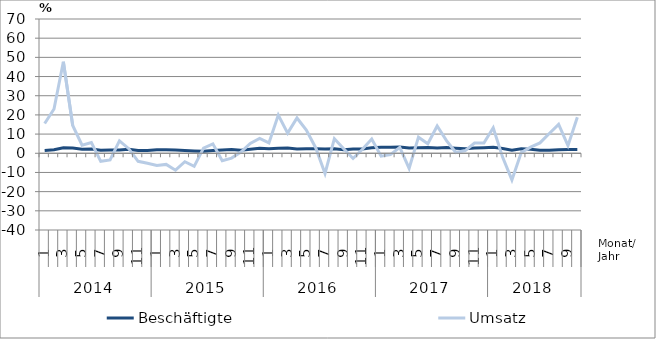
| Category | Beschäftigte | Umsatz |
|---|---|---|
| 0 | 1.4 | 15.5 |
| 1 | 1.8 | 23.1 |
| 2 | 2.9 | 47.7 |
| 3 | 2.7 | 14.5 |
| 4 | 2.1 | 4.2 |
| 5 | 2.2 | 5.6 |
| 6 | 1.6 | -4.2 |
| 7 | 1.7 | -3.5 |
| 8 | 1.7 | 6.5 |
| 9 | 2.1 | 2.4 |
| 10 | 1.4 | -4.2 |
| 11 | 1.4 | -5.2 |
| 12 | 1.8 | -6.4 |
| 13 | 1.8 | -5.8 |
| 14 | 1.7 | -8.8 |
| 15 | 1.5 | -4.4 |
| 16 | 1.2 | -6.8 |
| 17 | 1 | 2.7 |
| 18 | 1.4 | 4.9 |
| 19 | 1.7 | -3.9 |
| 20 | 2 | -2.5 |
| 21 | 1.6 | 0.6 |
| 22 | 2.1 | 5.1 |
| 23 | 2.6 | 7.7 |
| 24 | 2.4 | 5.4 |
| 25 | 2.6 | 19.9 |
| 26 | 2.7 | 10.5 |
| 27 | 2.2 | 18.4 |
| 28 | 2.3 | 12.1 |
| 29 | 2.3 | 2.9 |
| 30 | 2.2 | -10.5 |
| 31 | 2.4 | 7.6 |
| 32 | 1.8 | 2.4 |
| 33 | 2.2 | -2.7 |
| 34 | 2.2 | 2.1 |
| 35 | 2.9 | 7.4 |
| 36 | 3.2 | -1.5 |
| 37 | 3.2 | -0.7 |
| 38 | 3.3 | 3.1 |
| 39 | 2.7 | -7.9 |
| 40 | 2.9 | 8.4 |
| 41 | 3 | 5 |
| 42 | 2.8 | 14.2 |
| 43 | 3 | 6.6 |
| 44 | 2.6 | 0.4 |
| 45 | 2.3 | 1.4 |
| 46 | 2.7 | 5.3 |
| 47 | 2.9 | 5.4 |
| 48 | 3.1 | 13.3 |
| 49 | 2.5 | -2 |
| 50 | 1.6 | -13.9 |
| 51 | 2.4 | 0.4 |
| 52 | 2.1 | 3.2 |
| 53 | 1.6 | 5.4 |
| 54 | 1.6 | 10.3 |
| 55 | 1.8 | 15.1 |
| 56 | 2 | 4 |
| 57 | 2 | 18.8 |